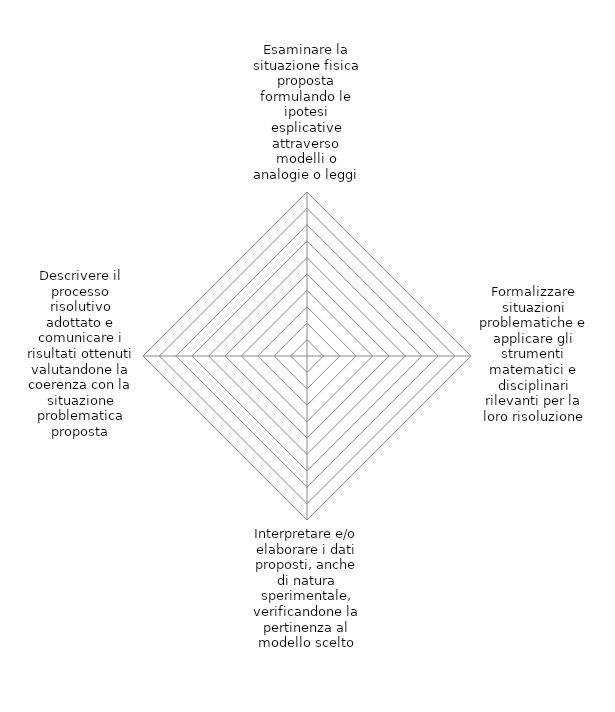
| Category | Series 0 |
|---|---|
| Esaminare la situazione fisica proposta formulando le ipotesi esplicative attraverso modelli o analogie o leggi | 0 |
| Formalizzare situazioni problematiche e applicare gli strumenti matematici e disciplinari rilevanti per la loro risoluzione | 0 |
| Interpretare e/o elaborare i dati proposti, anche di natura sperimentale, verificandone la pertinenza al modello scelto | 0 |
| Descrivere il processo risolutivo adottato e comunicare i risultati ottenuti valutandone la coerenza con la situazione problematica proposta | 0 |